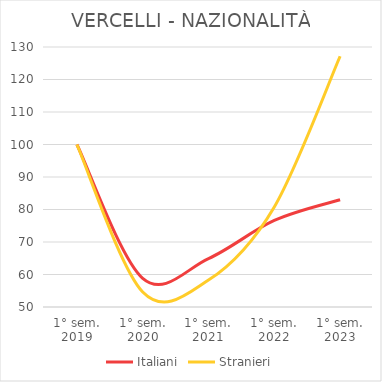
| Category | Italiani | Stranieri |
|---|---|---|
| 1° sem.
2019 | 100 | 100 |
| 1° sem.
2020 | 58.834 | 54.636 |
| 1° sem.
2021 | 64.906 | 58.278 |
| 1° sem.
2022 | 76.624 | 80.795 |
| 1° sem.
2023 | 82.999 | 127.152 |